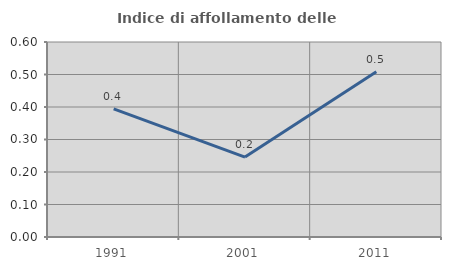
| Category | Indice di affollamento delle abitazioni  |
|---|---|
| 1991.0 | 0.394 |
| 2001.0 | 0.246 |
| 2011.0 | 0.508 |